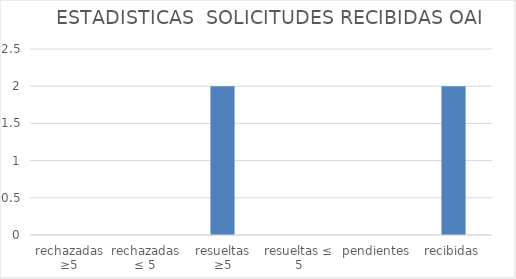
| Category | Series 0 |
|---|---|
| rechazadas ≥5 | 0 |
| rechazadas ≤ 5 | 0 |
| resueltas ≥5 | 2 |
| resueltas ≤ 5 | 0 |
| pendientes | 0 |
| recibidas | 2 |